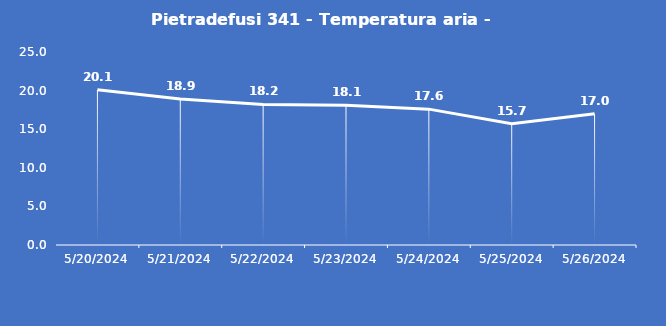
| Category | Pietradefusi 341 - Temperatura aria - Grezzo (°C) |
|---|---|
| 5/20/24 | 20.1 |
| 5/21/24 | 18.9 |
| 5/22/24 | 18.2 |
| 5/23/24 | 18.1 |
| 5/24/24 | 17.6 |
| 5/25/24 | 15.7 |
| 5/26/24 | 17 |